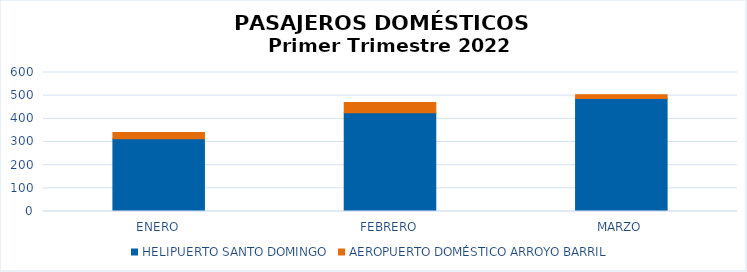
| Category | HELIPUERTO SANTO DOMINGO | AEROPUERTO DOMÉSTICO ARROYO BARRIL |
|---|---|---|
| ENERO | 314 | 27 |
| FEBRERO | 426 | 44 |
| MARZO | 488 | 16 |